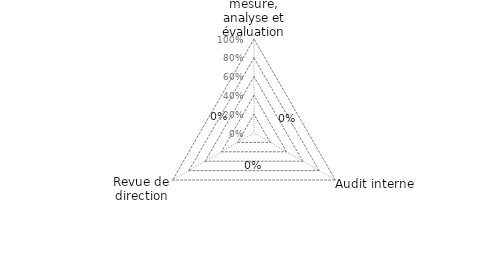
| Category | Art 9 |
|---|---|
| 0 | 0 |
| 1 | 0 |
| 2 | 0 |